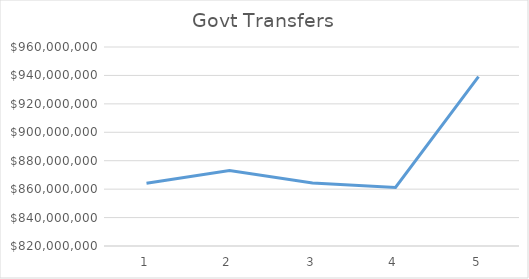
| Category | Series 0 |
|---|---|
| 0 | 864129000 |
| 1 | 873100000 |
| 2 | 864334000 |
| 3 | 861184000 |
| 4 | 939124000 |